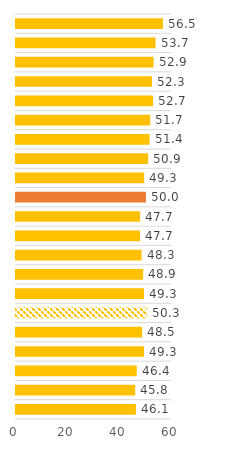
| Category | Soutien à l’égalité des droits pour les immigrés (% d'élèves) |
|---|---|
| Bulgarie | 46.126 |
| Serbie | 45.845 |
| Lettonie | 46.44 |
| Colombie | 49.267 |
| République slovaque | 48.498 |
| Roumanie | 50.332 |
| Slovénie | 49.258 |
| Chypre | 48.909 |
| Pologne | 48.306 |
| Lituanie | 47.716 |
| Estonie | 47.749 |
| Moyenne ICCS | 49.988 |
| Pays-Bas | 49.306 |
| Croatie | 50.85 |
| Malte | 51.367 |
| Espagne | 51.651 |
| Norvège | 52.714 |
| France | 52.302 |
| Italie | 52.91 |
| Suède | 53.657 |
| Taipei chinois | 56.55 |